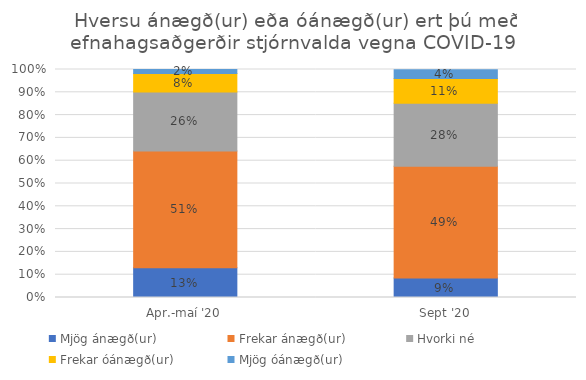
| Category | Mjög ánægð(ur) | Frekar ánægð(ur) | Hvorki né | Frekar óánægð(ur) | Mjög óánægð(ur) |
|---|---|---|---|---|---|
| Apr.-maí '20 | 0.131 | 0.512 | 0.258 | 0.082 | 0.017 |
| Sept '20 | 0.085 | 0.491 | 0.276 | 0.109 | 0.038 |